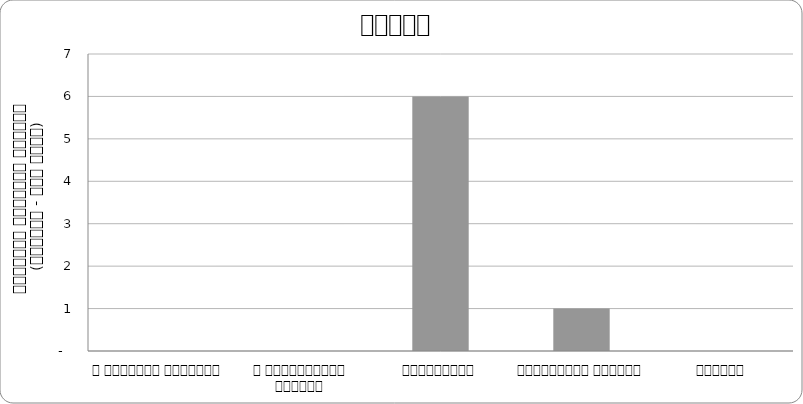
| Category | न्याय |
|---|---|
| द हिमालयन टाइम्स् | 0 |
| द काठमाण्डौं पोस्ट् | 0 |
| कान्तिपुर | 6 |
| अन्नपूर्ण पोस्ट् | 1 |
| नागरिक | 0 |